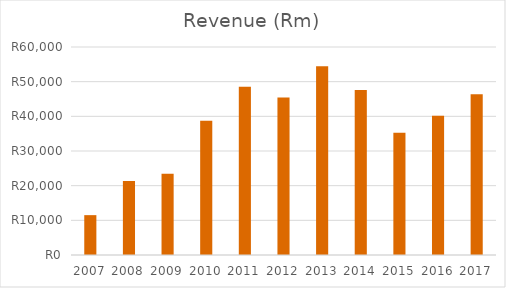
| Category | Revenue |
|---|---|
| 2007.0 | 11497 |
| 2008.0 | 21360 |
| 2009.0 | 23408 |
| 2010.0 | 38704 |
| 2011.0 | 48553 |
| 2012.0 | 45446 |
| 2013.0 | 54461 |
| 2014.0 | 47597 |
| 2015.0 | 35260 |
| 2016.0 | 40155 |
| 2017.0 | 46379 |